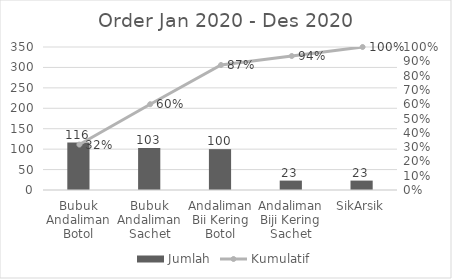
| Category | Jumlah |
|---|---|
| Bubuk Andaliman Botol | 116 |
| Bubuk Andaliman Sachet | 103 |
| Andaliman Bii Kering Botol | 100 |
| Andaliman Biji Kering Sachet | 23 |
| SikArsik | 23 |